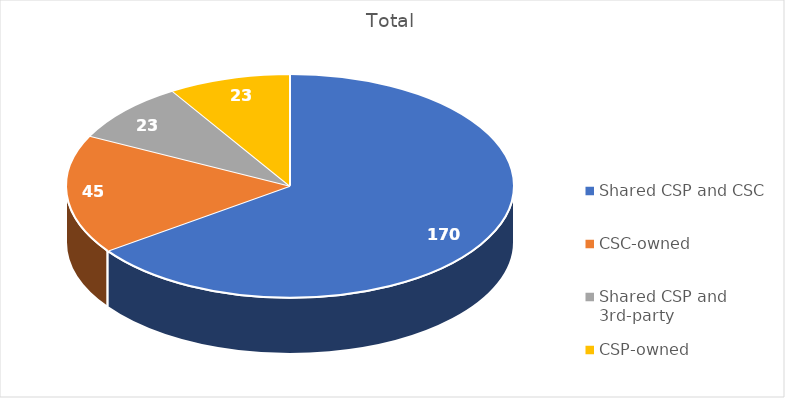
| Category | Total |
|---|---|
| Shared CSP and CSC | 170 |
| CSC-owned | 45 |
| Shared CSP and 3rd-party | 23 |
| CSP-owned | 23 |